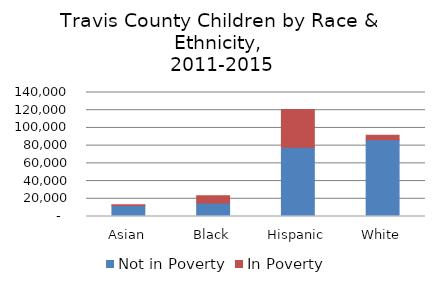
| Category | Not in Poverty | In Poverty |
|---|---|---|
| Asian | 12343 | 997 |
| Black | 15135 | 8302 |
| Hispanic | 78201 | 42719 |
| White | 86541 | 5114 |